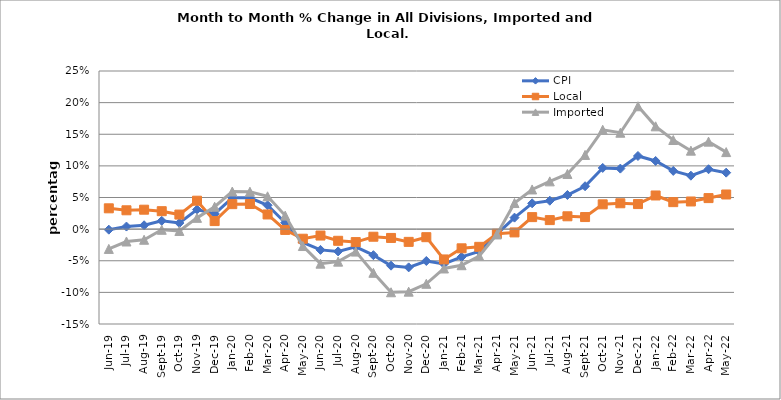
| Category | CPI | Local | Imported |
|---|---|---|---|
| 2019-06-01 | -0.001 | 0.033 | -0.031 |
| 2019-07-01 | 0.004 | 0.03 | -0.02 |
| 2019-08-01 | 0.006 | 0.031 | -0.017 |
| 2019-09-01 | 0.013 | 0.028 | -0.001 |
| 2019-10-01 | 0.01 | 0.023 | -0.003 |
| 2019-11-01 | 0.031 | 0.045 | 0.018 |
| 2019-12-01 | 0.024 | 0.013 | 0.035 |
| 2020-01-01 | 0.049 | 0.039 | 0.059 |
| 2020-02-01 | 0.05 | 0.04 | 0.059 |
| 2020-03-01 | 0.038 | 0.023 | 0.052 |
| 2020-04-01 | 0.01 | -0.001 | 0.021 |
| 2020-05-01 | -0.021 | -0.015 | -0.027 |
| 2020-06-01 | -0.033 | -0.01 | -0.055 |
| 2020-07-01 | -0.035 | -0.018 | -0.051 |
| 2020-08-01 | -0.028 | -0.02 | -0.036 |
| 2020-09-01 | -0.041 | -0.012 | -0.069 |
| 2020-10-01 | -0.058 | -0.014 | -0.1 |
| 2020-11-01 | -0.06 | -0.02 | -0.099 |
| 2020-12-01 | -0.05 | -0.013 | -0.086 |
| 2021-01-01 | -0.055 | -0.048 | -0.062 |
| 2021-02-01 | -0.044 | -0.03 | -0.057 |
| 2021-03-01 | -0.035 | -0.028 | -0.043 |
| 2021-04-01 | -0.008 | -0.007 | -0.008 |
| 2021-05-01 | 0.018 | -0.005 | 0.041 |
| 2021-06-01 | 0.041 | 0.019 | 0.063 |
| 2021-07-01 | 0.045 | 0.014 | 0.075 |
| 2021-08-01 | 0.054 | 0.02 | 0.087 |
| 2021-09-01 | 0.068 | 0.019 | 0.117 |
| 2021-10-01 | 0.097 | 0.039 | 0.157 |
| 2021-11-01 | 0.096 | 0.041 | 0.152 |
| 2021-12-01 | 0.116 | 0.04 | 0.194 |
| 2022-01-01 | 0.108 | 0.053 | 0.163 |
| 2022-02-01 | 0.092 | 0.043 | 0.141 |
| 2022-03-01 | 0.085 | 0.044 | 0.124 |
| 2022-04-01 | 0.095 | 0.049 | 0.138 |
| 2022-05-01 | 0.089 | 0.055 | 0.122 |